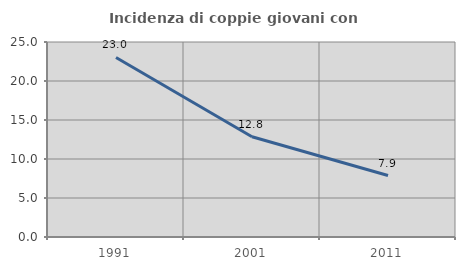
| Category | Incidenza di coppie giovani con figli |
|---|---|
| 1991.0 | 23.02 |
| 2001.0 | 12.85 |
| 2011.0 | 7.884 |